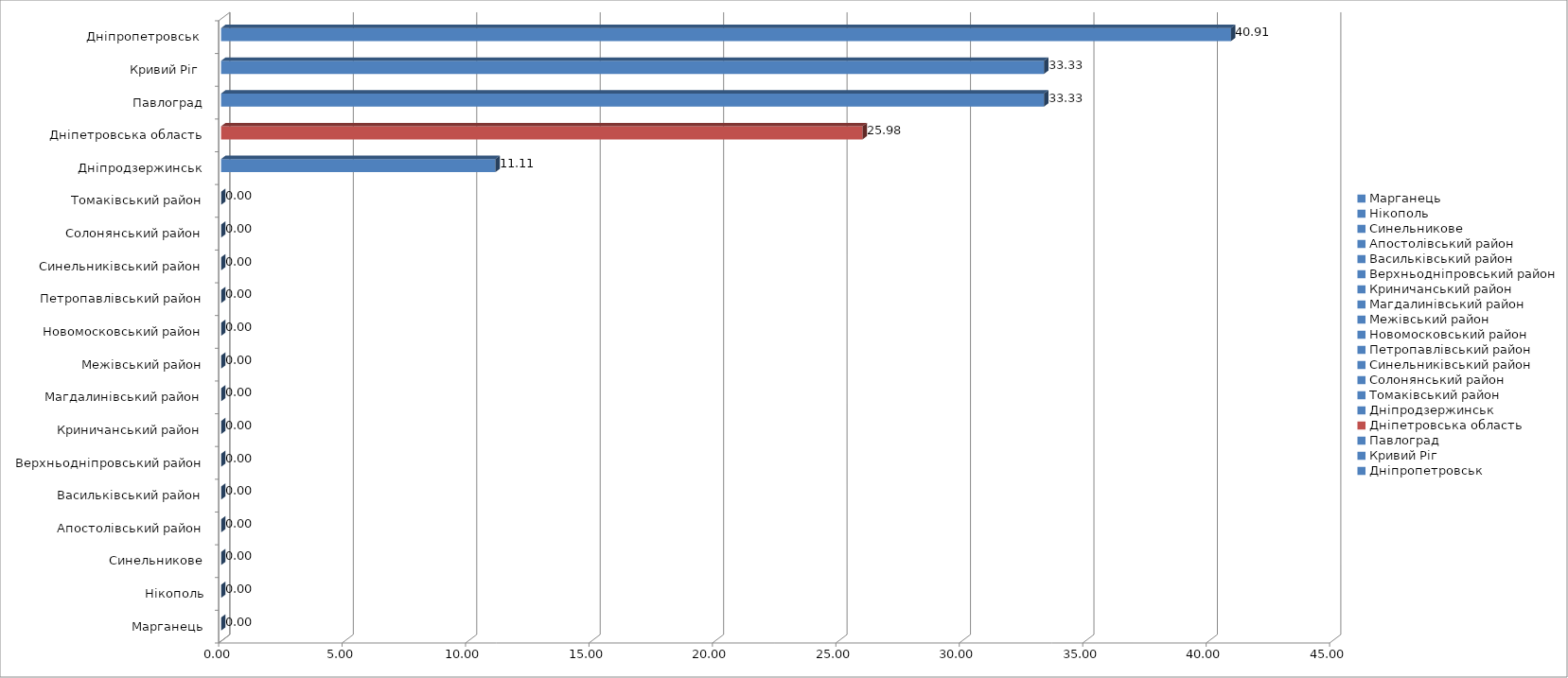
| Category | [160;200) |
|---|---|
| Марганець | 0 |
| Нікополь | 0 |
| Синельникове | 0 |
| Апостолівський район | 0 |
| Васильківський район | 0 |
| Верхньодніпровський район | 0 |
| Криничанський район | 0 |
| Магдалинівський район | 0 |
| Межівський район | 0 |
| Новомосковський район | 0 |
| Петропавлівський район | 0 |
| Синельниківський район | 0 |
| Солонянський район | 0 |
| Томаківський район | 0 |
| Дніпродзержинськ | 11.111 |
| Дніпетровська область | 25.984 |
| Павлоград | 33.333 |
| Кривий Ріг  | 33.334 |
| Дніпропетровськ  | 40.907 |